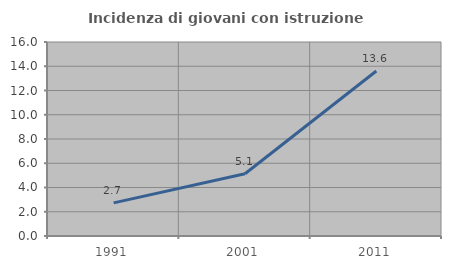
| Category | Incidenza di giovani con istruzione universitaria |
|---|---|
| 1991.0 | 2.734 |
| 2001.0 | 5.137 |
| 2011.0 | 13.605 |